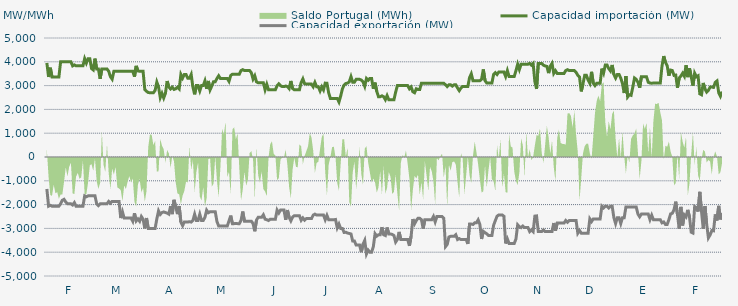
| Category | Capacidad importación (MW) | Capacidad exportación (MW) |
|---|---|---|
| 0 | 3952.083 | -1341.667 |
| 1900-01-01 | 3362.5 | -2066.667 |
| 1900-01-02 | 3752.083 | -2029.167 |
| 1900-01-03 | 3362.5 | -2066.667 |
| 1900-01-04 | 3362.5 | -2066.667 |
| 1900-01-05 | 3362.5 | -2066.667 |
| 1900-01-06 | 3362.5 | -2066.667 |
| 1900-01-07 | 3362.5 | -2066.667 |
| 1900-01-08 | 4000 | -1966.667 |
| 1900-01-09 | 4000 | -1816.667 |
| 1900-01-10 | 4000 | -1779.167 |
| 1900-01-11 | 4000 | -1891.667 |
| 1900-01-12 | 4000 | -1966.667 |
| 1900-01-13 | 4000 | -1966.667 |
| 1900-01-14 | 4000 | -1966.667 |
| 1900-01-15 | 3829.167 | -2016.667 |
| 1900-01-16 | 3870.833 | -1916.667 |
| 1900-01-17 | 3829.167 | -2066.667 |
| 1900-01-18 | 3829.167 | -2066.667 |
| 1900-01-19 | 3829.167 | -2066.667 |
| 1900-01-20 | 3829.167 | -2066.667 |
| 1900-01-21 | 3829.167 | -2066.667 |
| 1900-01-22 | 4133.333 | -1633.333 |
| 1900-01-23 | 3945.833 | -1670.833 |
| 1900-01-24 | 4133.333 | -1633.333 |
| 1900-01-25 | 4133.333 | -1633.333 |
| 1900-01-26 | 3716.667 | -1633.333 |
| 1900-01-27 | 3658.333 | -1633.333 |
| 1900-01-28 | 4133.333 | -1633.333 |
| 1900-01-29 | 3700 | -1966.667 |
| 1900-01-30 | 3700 | -2041.667 |
| 1900-01-31 | 3283.333 | -1966.667 |
| 1900-02-01 | 3700 | -1966.667 |
| 1900-02-02 | 3700 | -1966.667 |
| 1900-02-03 | 3700 | -1966.667 |
| 1900-02-04 | 3700 | -1966.667 |
| 1900-02-05 | 3600 | -1866.667 |
| 1900-02-06 | 3375 | -1941.667 |
| 1900-02-07 | 3270.833 | -1866.667 |
| 1900-02-08 | 3600 | -1866.667 |
| 1900-02-09 | 3600 | -1866.667 |
| 1900-02-10 | 3600 | -1866.667 |
| 1900-02-11 | 3600 | -1866.667 |
| 1900-02-12 | 3600 | -2566.667 |
| 1900-02-13 | 3600 | -2304.167 |
| 1900-02-14 | 3600 | -2566.667 |
| 1900-02-15 | 3600 | -2566.667 |
| 1900-02-16 | 3600 | -2566.667 |
| 1900-02-17 | 3600 | -2566.667 |
| 1900-02-18 | 3600 | -2566.667 |
| 1900-02-19 | 3600 | -2700 |
| 1900-02-20 | 3375 | -2362.5 |
| 1900-02-21 | 3829.167 | -2687.5 |
| 1900-02-22 | 3616.667 | -2600 |
| 1900-02-23 | 3600 | -2700 |
| 1900-02-24 | 3600 | -2500 |
| 1900-02-25 | 3600 | -2612.5 |
| 1900-02-26 | 2833.333 | -3000 |
| 1900-02-27 | 2760.87 | -2565.217 |
| 1900-02-28 | 2708.333 | -3000 |
| 1900-02-28 | 2700 | -3000 |
| 1900-03-01 | 2700 | -3000 |
| 1900-03-02 | 2700 | -3000 |
| 1900-03-03 | 2800 | -3000 |
| 1900-03-04 | 3150 | -2600 |
| 1900-03-05 | 2945.833 | -2262.5 |
| 1900-03-06 | 2495.833 | -2412.5 |
| 1900-03-07 | 2675 | -2333.333 |
| 1900-03-08 | 2479.167 | -2308.333 |
| 1900-03-09 | 2675 | -2333.333 |
| 1900-03-10 | 3191.667 | -2358.333 |
| 1900-03-11 | 2933.333 | -2400 |
| 1900-03-12 | 2858.333 | -2062.5 |
| 1900-03-13 | 2933.333 | -2400 |
| 1900-03-14 | 2839.583 | -1800 |
| 1900-03-15 | 2864.583 | -2091.667 |
| 1900-03-16 | 2933.333 | -2400 |
| 1900-03-17 | 2858.333 | -2062.5 |
| 1900-03-18 | 3466.667 | -2733.333 |
| 1900-03-19 | 3316.667 | -2883.333 |
| 1900-03-20 | 3466.667 | -2733.333 |
| 1900-03-21 | 3466.667 | -2733.333 |
| 1900-03-22 | 3310.417 | -2733.333 |
| 1900-03-23 | 3306.25 | -2716.667 |
| 1900-03-24 | 3466.667 | -2733.333 |
| 1900-03-25 | 2933.333 | -2666.667 |
| 1900-03-26 | 2633.333 | -2404.167 |
| 1900-03-27 | 3000 | -2666.667 |
| 1900-03-28 | 3000 | -2666.667 |
| 1900-03-29 | 2775 | -2404.167 |
| 1900-03-30 | 3000 | -2666.667 |
| 1900-03-31 | 3000 | -2666.667 |
| 1900-04-01 | 3200 | -2533.333 |
| 1900-04-02 | 2862.5 | -2233.333 |
| 1900-04-03 | 3195.833 | -2341.667 |
| 1900-04-04 | 2822.917 | -2300 |
| 1900-04-05 | 2983.333 | -2300 |
| 1900-04-06 | 3166.667 | -2300 |
| 1900-04-07 | 3166.667 | -2300 |
| 1900-04-08 | 3300 | -2712.5 |
| 1900-04-09 | 3412.5 | -2900 |
| 1900-04-10 | 3300 | -2900 |
| 1900-04-11 | 3300 | -2900 |
| 1900-04-12 | 3300 | -2900 |
| 1900-04-13 | 3300 | -2900 |
| 1900-04-14 | 3300 | -2900 |
| 1900-04-15 | 3179.167 | -2687.5 |
| 1900-04-16 | 3425 | -2462.5 |
| 1900-04-17 | 3479.167 | -2800 |
| 1900-04-18 | 3479.167 | -2800 |
| 1900-04-19 | 3479.167 | -2791.667 |
| 1900-04-20 | 3479.167 | -2800 |
| 1900-04-21 | 3479.167 | -2800 |
| 1900-04-22 | 3633.333 | -2666.667 |
| 1900-04-23 | 3670.833 | -2291.667 |
| 1900-04-24 | 3633.333 | -2700 |
| 1900-04-25 | 3633.333 | -2700 |
| 1900-04-26 | 3633.333 | -2700 |
| 1900-04-27 | 3633.333 | -2700 |
| 1900-04-28 | 3541.667 | -2695.833 |
| 1900-04-29 | 3275 | -2800 |
| 1900-04-30 | 3412.5 | -3120.833 |
| 1900-05-01 | 3158.333 | -2650 |
| 1900-05-02 | 3116.667 | -2533.333 |
| 1900-05-03 | 3116.667 | -2533.333 |
| 1900-05-04 | 3116.667 | -2533.333 |
| 1900-05-05 | 3116.667 | -2429.167 |
| 1900-05-06 | 2825 | -2612.5 |
| 1900-05-07 | 3054.167 | -2633.333 |
| 1900-05-08 | 2825 | -2668.75 |
| 1900-05-09 | 2825 | -2612.5 |
| 1900-05-10 | 2825 | -2612.5 |
| 1900-05-11 | 2825 | -2612.5 |
| 1900-05-12 | 2825 | -2612.5 |
| 1900-05-13 | 2995.833 | -2229.167 |
| 1900-05-14 | 3075 | -2352.083 |
| 1900-05-15 | 2995.833 | -2229.167 |
| 1900-05-16 | 2958.333 | -2229.167 |
| 1900-05-17 | 2958.333 | -2229.167 |
| 1900-05-18 | 2981.25 | -2641.667 |
| 1900-05-19 | 2958.333 | -2229.167 |
| 1900-05-20 | 2875 | -2533.333 |
| 1900-05-21 | 3195.833 | -2683.333 |
| 1900-05-22 | 2875 | -2525 |
| 1900-05-23 | 2825 | -2466.667 |
| 1900-05-24 | 2825 | -2466.667 |
| 1900-05-25 | 2825 | -2466.667 |
| 1900-05-26 | 2825 | -2466.667 |
| 1900-05-27 | 3129.167 | -2658.333 |
| 1900-05-28 | 3283.333 | -2558.333 |
| 1900-05-29 | 3081.25 | -2654.167 |
| 1900-05-30 | 3062.5 | -2587.5 |
| 1900-05-31 | 3062.5 | -2587.5 |
| 1900-06-01 | 3062.5 | -2587.5 |
| 1900-06-02 | 3062.5 | -2587.5 |
| 1900-06-03 | 2950 | -2441.667 |
| 1900-06-04 | 3133.333 | -2400 |
| 1900-06-05 | 2950 | -2441.667 |
| 1900-06-06 | 2950 | -2441.667 |
| 1900-06-07 | 2775 | -2441.667 |
| 1900-06-08 | 2950 | -2441.667 |
| 1900-06-09 | 2818.75 | -2441.667 |
| 1900-06-10 | 3104.167 | -2637.5 |
| 1900-06-11 | 3100 | -2452.083 |
| 1900-06-12 | 2697.917 | -2637.5 |
| 1900-06-13 | 2462.5 | -2637.5 |
| 1900-06-14 | 2462.5 | -2637.5 |
| 1900-06-15 | 2462.5 | -2637.5 |
| 1900-06-16 | 2462.5 | -2625 |
| 1900-06-17 | 2462.5 | -2975 |
| 1900-06-18 | 2310.417 | -2816.667 |
| 1900-06-19 | 2562.5 | -3000 |
| 1900-06-20 | 2862.5 | -3000 |
| 1900-06-21 | 3025 | -3170.833 |
| 1900-06-22 | 3087.5 | -3158.333 |
| 1900-06-23 | 3106.25 | -3195.833 |
| 1900-06-24 | 3154.167 | -3212.917 |
| 1900-06-25 | 3377.083 | -3233.333 |
| 1900-06-26 | 3145.833 | -3533.333 |
| 1900-06-27 | 3145.833 | -3533.333 |
| 1900-06-28 | 3262.5 | -3700 |
| 1900-06-29 | 3262.5 | -3700 |
| 1900-06-30 | 3262.5 | -3700 |
| 1900-07-01 | 3233.333 | -4000 |
| 1900-07-02 | 3158.333 | -3662.5 |
| 1900-07-03 | 2970.833 | -3504.167 |
| 1900-07-04 | 3300 | -4075 |
| 1900-07-05 | 3225 | -3912.5 |
| 1900-07-06 | 3300 | -4000 |
| 1900-07-07 | 3300 | -4000 |
| 1900-07-08 | 2866.667 | -3766.667 |
| 1900-07-09 | 3125 | -3222.917 |
| 1900-07-10 | 2754.167 | -3325 |
| 1900-07-11 | 2533.333 | -3266.667 |
| 1900-07-12 | 2533.333 | -3266.667 |
| 1900-07-13 | 2570.833 | -2947.917 |
| 1900-07-14 | 2533.333 | -3266.667 |
| 1900-07-15 | 2408.333 | -3300 |
| 1900-07-16 | 2583.333 | -2962.5 |
| 1900-07-17 | 2408.333 | -3237.5 |
| 1900-07-18 | 2408.333 | -3233.333 |
| 1900-07-19 | 2408.333 | -3254.167 |
| 1900-07-20 | 2408.333 | -3300 |
| 1900-07-21 | 2729.167 | -3575 |
| 1900-07-22 | 3000 | -3466.667 |
| 1900-07-23 | 3000 | -3147.917 |
| 1900-07-24 | 3000 | -3466.667 |
| 1900-07-25 | 3000 | -3466.667 |
| 1900-07-26 | 3000 | -3466.667 |
| 1900-07-27 | 3000 | -3466.667 |
| 1900-07-28 | 3000 | -3466.667 |
| 1900-07-29 | 2866.667 | -3733.333 |
| 1900-07-30 | 2941.667 | -3320.833 |
| 1900-07-31 | 2741.667 | -2608.333 |
| 1900-08-01 | 2700 | -2808.333 |
| 1900-08-02 | 2866.667 | -2670.833 |
| 1900-08-03 | 2833.333 | -2575 |
| 1900-08-04 | 2833.333 | -2575 |
| 1900-08-05 | 3100 | -2633.333 |
| 1900-08-06 | 3100 | -3008.333 |
| 1900-08-07 | 3100 | -2633.333 |
| 1900-08-08 | 3100 | -2633.333 |
| 1900-08-09 | 3100 | -2633.333 |
| 1900-08-10 | 3100 | -2633.333 |
| 1900-08-11 | 3100 | -2633.333 |
| 1900-08-12 | 3100 | -2500 |
| 1900-08-13 | 3100 | -2725 |
| 1900-08-14 | 3100 | -2500 |
| 1900-08-15 | 3100 | -2500 |
| 1900-08-16 | 3100 | -2500 |
| 1900-08-17 | 3100 | -2500 |
| 1900-08-18 | 3100 | -2575 |
| 1900-08-19 | 3033.333 | -3766.667 |
| 1900-08-20 | 2958.333 | -3672.917 |
| 1900-08-21 | 3033.333 | -3360.417 |
| 1900-08-22 | 3033.333 | -3333.333 |
| 1900-08-23 | 2976.875 | -3333.333 |
| 1900-08-24 | 3033.333 | -3333.333 |
| 1900-08-25 | 3033.333 | -3266.667 |
| 1900-08-26 | 2900 | -3466.667 |
| 1900-08-27 | 2787.5 | -3429.167 |
| 1900-08-28 | 2900 | -3466.667 |
| 1900-08-29 | 2966.667 | -3466.667 |
| 1900-08-30 | 2966.667 | -3466.667 |
| 1900-08-31 | 2966.667 | -3466.667 |
| 1900-09-01 | 2966.667 | -3654.167 |
| 1900-09-02 | 3335.417 | -2816.667 |
| 1900-09-03 | 3495.833 | -2816.667 |
| 1900-09-04 | 3204.167 | -2833.333 |
| 1900-09-05 | 3204.167 | -2766.667 |
| 1900-09-06 | 3204.167 | -2766.667 |
| 1900-09-07 | 3204.167 | -2641.667 |
| 1900-09-08 | 3204.167 | -2833.333 |
| 1900-09-09 | 3266.667 | -3443.75 |
| 1900-09-10 | 3679.167 | -3122.917 |
| 1900-09-11 | 3208.333 | -3179.167 |
| 1900-09-12 | 3108.333 | -3225 |
| 1900-09-13 | 3108.333 | -3300 |
| 1900-09-14 | 3108.333 | -3300 |
| 1900-09-15 | 3108.333 | -3300 |
| 1900-09-16 | 3466.667 | -2866.667 |
| 1900-09-17 | 3541.667 | -2672.5 |
| 1900-09-18 | 3466.667 | -2487.5 |
| 1900-09-19 | 3570.833 | -2433.333 |
| 1900-09-20 | 3570.833 | -2433.333 |
| 1900-09-21 | 3570.833 | -2433.333 |
| 1900-09-22 | 3570.833 | -2491.667 |
| 1900-09-23 | 3383.333 | -3633.333 |
| 1900-09-24 | 3632 | -3440 |
| 1900-09-25 | 3383.333 | -3633.333 |
| 1900-09-26 | 3383.333 | -3633.333 |
| 1900-09-27 | 3383.333 | -3633.333 |
| 1900-09-28 | 3383.333 | -3633.333 |
| 1900-09-29 | 3625 | -3445.833 |
| 1900-09-30 | 3900 | -2849.25 |
| 1900-10-01 | 3675 | -2929.167 |
| 1900-10-02 | 3900 | -2966.667 |
| 1900-10-03 | 3900 | -2900 |
| 1900-10-04 | 3900 | -2966.667 |
| 1900-10-05 | 3900 | -2966.667 |
| 1900-10-06 | 3900 | -2966.667 |
| 1900-10-07 | 3933.333 | -3133.333 |
| 1900-10-08 | 3858.333 | -3058.333 |
| 1900-10-09 | 3933.333 | -3133.333 |
| 1900-10-10 | 3175 | -2483.333 |
| 1900-10-11 | 2862.5 | -2475 |
| 1900-10-12 | 3933.333 | -3133.333 |
| 1900-10-13 | 3933.333 | -3133.333 |
| 1900-10-14 | 3933.333 | -3133.333 |
| 1900-10-15 | 3858.333 | -3058.333 |
| 1900-10-16 | 3825 | -3133.333 |
| 1900-10-17 | 3808.333 | -3133.333 |
| 1900-10-18 | 3525 | -3133.333 |
| 1900-10-19 | 3816.708 | -3133.333 |
| 1900-10-20 | 3933.333 | -3133.333 |
| 1900-10-21 | 3512.5 | -2775 |
| 1900-10-22 | 3627.083 | -3095.833 |
| 1900-10-23 | 3512.5 | -2775 |
| 1900-10-24 | 3512.5 | -2775 |
| 1900-10-25 | 3512.5 | -2775 |
| 1900-10-26 | 3512.5 | -2775 |
| 1900-10-27 | 3512.5 | -2775 |
| 1900-10-28 | 3633.333 | -2666.667 |
| 1900-10-29 | 3670.833 | -2741.667 |
| 1900-10-30 | 3633.333 | -2666.667 |
| 1900-10-31 | 3633.333 | -2666.667 |
| 1900-11-01 | 3633.333 | -2666.667 |
| 1900-11-02 | 3633.333 | -2666.667 |
| 1900-11-03 | 3557.083 | -2666.667 |
| 1900-11-04 | 3433.333 | -3200 |
| 1900-11-05 | 3358.333 | -3087.5 |
| 1900-11-06 | 2756.25 | -3200 |
| 1900-11-07 | 3066.667 | -3200 |
| 1900-11-08 | 3433.333 | -3200 |
| 1900-11-09 | 3433.333 | -3200 |
| 1900-11-10 | 3232.417 | -3200 |
| 1900-11-11 | 3100 | -2600 |
| 1900-11-12 | 3579.167 | -2712.5 |
| 1900-11-13 | 3100 | -2600 |
| 1900-11-14 | 3000.75 | -2600 |
| 1900-11-15 | 3100 | -2600 |
| 1900-11-16 | 3100 | -2600 |
| 1900-11-17 | 3100 | -2600 |
| 1900-11-18 | 3712.917 | -2066.667 |
| 1900-11-19 | 3527.083 | -2141.667 |
| 1900-11-20 | 3866.667 | -2066.667 |
| 1900-11-21 | 3866.667 | -2066.667 |
| 1900-11-22 | 3716.667 | -2141.667 |
| 1900-11-23 | 3616.667 | -2066.667 |
| 1900-11-24 | 3866.667 | -2066.667 |
| 1900-11-25 | 3466.667 | -2550 |
| 1900-11-26 | 3316.667 | -2795.833 |
| 1900-11-27 | 3466.667 | -2550 |
| 1900-11-28 | 3466.667 | -2550 |
| 1900-11-29 | 3316.667 | -2795.833 |
| 1900-11-30 | 3082.167 | -2550 |
| 1900-12-01 | 2687.5 | -2550 |
| 1900-12-02 | 3400 | -2100 |
| 1900-12-03 | 2520.833 | -2100 |
| 1900-12-04 | 2614.583 | -2100 |
| 1900-12-05 | 2591.25 | -2100 |
| 1900-12-06 | 2932.083 | -2100 |
| 1900-12-07 | 3318.75 | -2100 |
| 1900-12-08 | 3262.5 | -2100 |
| 1900-12-09 | 3139.583 | -2400 |
| 1900-12-10 | 2912.5 | -2512.5 |
| 1900-12-11 | 3366.667 | -2400 |
| 1900-12-12 | 3366.667 | -2400 |
| 1900-12-13 | 3366.667 | -2400 |
| 1900-12-14 | 3366.667 | -2400 |
| 1900-12-15 | 3139.583 | -2400 |
| 1900-12-16 | 3108.333 | -2633.333 |
| 1900-12-17 | 3100 | -2445.833 |
| 1900-12-18 | 3108.333 | -2633.333 |
| 1900-12-19 | 3108.333 | -2633.333 |
| 1900-12-20 | 3108.333 | -2633.333 |
| 1900-12-21 | 3108.333 | -2633.333 |
| 1900-12-22 | 3108.333 | -2633.333 |
| 1900-12-23 | 3822.917 | -2766.667 |
| 1900-12-24 | 4239.583 | -2729.167 |
| 1900-12-25 | 3979.167 | -2833.333 |
| 1900-12-26 | 3841.667 | -2833.333 |
| 1900-12-27 | 3414.375 | -2634.375 |
| 1900-12-28 | 3652.5 | -2392.5 |
| 1900-12-29 | 3633.75 | -2364.375 |
| 1900-12-30 | 3431.25 | -2212.5 |
| 1900-12-31 | 3442.5 | -1876.875 |
| 1901-01-01 | 2908.125 | -2420.625 |
| 1901-01-02 | 3318.75 | -3009.375 |
| 1901-01-03 | 3401.25 | -2096.25 |
| 1901-01-04 | 3519.375 | -2876.25 |
| 1901-01-05 | 3392.5 | -2430 |
| 1901-01-06 | 3856.875 | -2512.5 |
| 1901-01-07 | 3356.25 | -2221.875 |
| 1901-01-08 | 3727.5 | -2516.25 |
| 1901-01-09 | 3372.5 | -3157.5 |
| 1901-01-10 | 3000.208 | -3195 |
| 1901-01-11 | 3522.083 | -2079.375 |
| 1901-01-12 | 3371.667 | -2122.5 |
| 1901-01-13 | 3412.5 | -2291.25 |
| 1901-01-14 | 2653.125 | -1464.375 |
| 1901-01-15 | 2615 | -2298.75 |
| 1901-01-16 | 3110.625 | -3018.75 |
| 1901-01-17 | 2861.792 | -2062.5 |
| 1901-01-18 | 2726.042 | -2823.75 |
| 1901-01-19 | 2799.583 | -3397.5 |
| 1901-01-20 | 2936.25 | -3273.75 |
| 1901-01-21 | 2938.125 | -3091.875 |
| 1901-01-22 | 2925 | -3101.25 |
| 1901-01-23 | 3136.875 | -2413.125 |
| 1901-01-24 | 3195.208 | -2666.25 |
| 1901-01-25 | 2702.083 | -2053.125 |
| 1901-01-26 | 2556.042 | -2621.25 |
| 1901-01-27 | 2748.75 | -2355 |